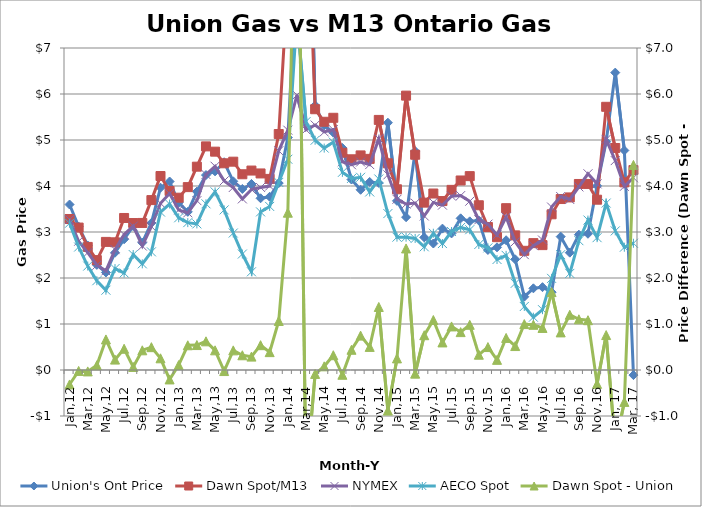
| Category | Union's Ont Price | Dawn Spot/M13 | NYMEX | AECO Spot |
|---|---|---|---|---|
| Jan,12 | 3.597 | 3.283 | 3.271 | 3.191 |
| Feb,12 | 3.117 | 3.096 | 2.799 | 2.674 |
| Mar,12 | 2.707 | 2.676 | 2.551 | 2.259 |
| Apr,12 | 2.286 | 2.389 | 2.277 | 1.941 |
| May,12 | 2.12 | 2.785 | 2.155 | 1.734 |
| Jun,12 | 2.55 | 2.776 | 2.617 | 2.205 |
| Jul,12 | 2.843 | 3.305 | 2.944 | 2.109 |
| Aug,12 | 3.129 | 3.195 | 3.128 | 2.51 |
| Sep,12 | 2.769 | 3.197 | 2.695 | 2.308 |
| Oct,12 | 3.197 | 3.694 | 3.119 | 2.569 |
| Nov,12 | 3.963 | 4.217 | 3.624 | 3.434 |
| Dec,12 | 4.098 | 3.892 | 3.836 | 3.608 |
| Jan,13 | 3.638 | 3.746 | 3.478 | 3.309 |
| Feb,13 | 3.438 | 3.976 | 3.417 | 3.204 |
| Mar,13 | 3.878 | 4.42 | 3.682 | 3.176 |
| Apr,13 | 4.238 | 4.861 | 4.249 | 3.613 |
| May,13 | 4.319 | 4.746 | 4.43 | 3.872 |
| Jun,13 | 4.516 | 4.493 | 4.112 | 3.481 |
| Jul,13 | 4.102 | 4.529 | 3.967 | 2.978 |
| Aug,13 | 3.935 | 4.255 | 3.719 | 2.521 |
| Sep,13 | 4.045 | 4.336 | 3.924 | 2.135 |
| Oct,13 | 3.733 | 4.273 | 3.968 | 3.437 |
| Nov,13 | 3.766 | 4.154 | 3.999 | 3.556 |
| Dec,13 | 4.063 | 5.13 | 4.765 | 4.078 |
| Jan,14 | 5.053 | 8.473 | 5.213 | 4.582 |
| Feb,14 | 8.808 | 21.255 | 5.978 | 7.704 |
| Mar,14 | 13.418 | 11.01 | 5.22 | 5.4 |
| Apr,14 | 5.754 | 5.669 | 5.325 | 4.995 |
| May,14 | 5.316 | 5.396 | 5.174 | 4.824 |
| Jun,14 | 5.162 | 5.483 | 5.225 | 4.954 |
| Jul,14 | 4.827 | 4.723 | 4.526 | 4.297 |
| Aug,14 | 4.141 | 4.581 | 4.462 | 4.164 |
| Sep,14 | 3.918 | 4.665 | 4.521 | 4.189 |
| Oct,14 | 4.088 | 4.59 | 4.465 | 3.87 |
| Nov,14 | 4.067 | 5.437 | 5.026 | 4.153 |
| Dec,14 | 5.376 | 4.494 | 4.243 | 3.401 |
| Jan,15 | 3.677 | 3.929 | 3.712 | 2.888 |
| Feb,15 | 3.322 | 5.965 | 3.608 | 2.888 |
| Mar,15 | 4.758 | 4.679 | 3.629 | 2.859 |
| Apr,15 | 2.882 | 3.639 | 3.348 | 2.678 |
| May,15 | 2.75 | 3.836 | 3.644 | 2.973 |
| Jun,15 | 3.074 | 3.673 | 3.584 | 2.749 |
| Jul,15 | 2.969 | 3.916 | 3.779 | 3.01 |
| Aug,15 | 3.297 | 4.12 | 3.791 | 3.099 |
| Sep,15 | 3.231 | 4.214 | 3.669 | 3.05 |
| Oct,15 | 3.249 | 3.581 | 3.266 | 2.729 |
| Nov,15 | 2.61 | 3.108 | 3.171 | 2.655 |
| Dec,15 | 2.667 | 2.888 | 2.935 | 2.402 |
| Jan,16 | 2.821 | 3.518 | 3.324 | 2.492 |
| Feb,16 | 2.406 | 2.927 | 2.787 | 1.884 |
| Mar,16 | 1.593 | 2.591 | 2.508 | 1.381 |
| Apr,16 | 1.775 | 2.758 | 2.704 | 1.148 |
| May,16 | 1.801 | 2.715 | 2.826 | 1.312 |
| Jun,16 | 1.69 | 3.385 | 3.542 | 1.992 |
| Jul,16 | 2.899 | 3.716 | 3.771 | 2.508 |
| Aug,16 | 2.551 | 3.752 | 3.707 | 2.1 |
| Sep,16 | 2.942 | 4.044 | 3.981 | 2.811 |
| Oct,16 | 2.962 | 4.045 | 4.266 | 3.26 |
| Nov,16 | 4.004 | 3.702 | 4.046 | 2.877 |
| Dec, 16 | 4.963 | 5.722 | 5.013 | 3.629 |
| Jan, 17 | 6.465 | 4.826 | 4.552 | 3.024 |
| Feb, 17 | 4.773 | 4.08 | 3.992 | 2.669 |
| Mar, 17 | -0.11 | 4.347 | 4.179 | 2.755 |